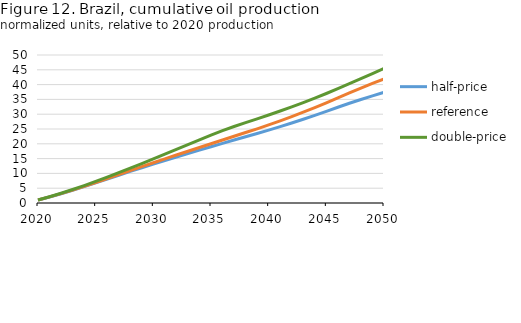
| Category | half-price | reference | double-price |
|---|---|---|---|
| 2020 | 0.994 | 1 | 1.024 |
| 2021 | 2.04 | 2.057 | 2.12 |
| 2022 | 3.141 | 3.173 | 3.293 |
| 2023 | 4.299 | 4.35 | 4.545 |
| 2024 | 5.517 | 5.593 | 5.881 |
| 2025 | 6.782 | 6.889 | 7.285 |
| 2026 | 8.072 | 8.219 | 8.742 |
| 2027 | 9.382 | 9.581 | 10.246 |
| 2028 | 10.663 | 10.942 | 11.776 |
| 2029 | 11.918 | 12.283 | 13.329 |
| 2030 | 13.149 | 13.607 | 14.912 |
| 2031 | 14.358 | 14.915 | 16.517 |
| 2032 | 15.547 | 16.21 | 18.144 |
| 2033 | 16.719 | 17.49 | 19.751 |
| 2034 | 17.876 | 18.763 | 21.353 |
| 2035 | 19.024 | 20.028 | 22.943 |
| 2036 | 20.159 | 21.289 | 24.443 |
| 2037 | 21.282 | 22.548 | 25.845 |
| 2038 | 22.394 | 23.806 | 27.176 |
| 2039 | 23.496 | 25.058 | 28.438 |
| 2040 | 24.637 | 26.379 | 29.742 |
| 2041 | 25.818 | 27.756 | 31.086 |
| 2042 | 27.039 | 29.196 | 32.483 |
| 2043 | 28.302 | 30.691 | 33.929 |
| 2044 | 29.607 | 32.242 | 35.435 |
| 2045 | 30.954 | 33.846 | 36.998 |
| 2046 | 32.344 | 35.503 | 38.638 |
| 2047 | 33.691 | 37.173 | 40.302 |
| 2048 | 34.971 | 38.832 | 41.982 |
| 2049 | 36.197 | 40.401 | 43.685 |
| 2050 | 37.381 | 41.883 | 45.438 |